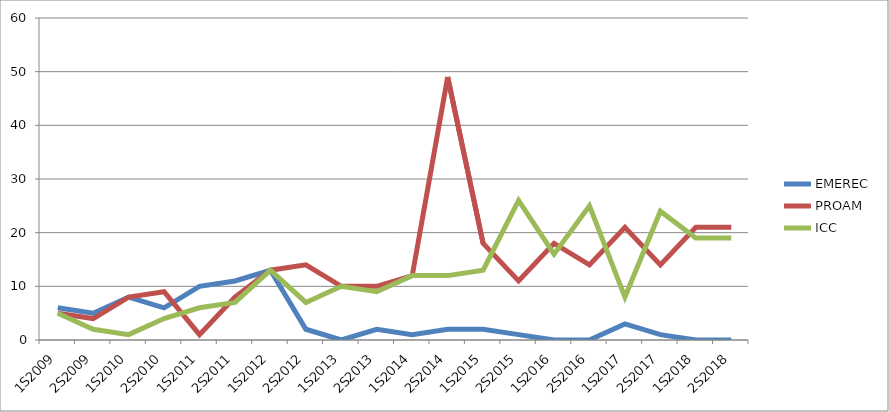
| Category | EMEREC | PROAM | ICC |
|---|---|---|---|
| 1S2009 | 6 | 5 | 5 |
| 2S2009 | 5 | 4 | 2 |
| 1S2010 | 8 | 8 | 1 |
| 2S2010 | 6 | 9 | 4 |
| 1S2011 | 10 | 1 | 6 |
| 2S2011 | 11 | 8 | 7 |
| 1S2012 | 13 | 13 | 13 |
| 2S2012 | 2 | 14 | 7 |
| 1S2013 | 0 | 10 | 10 |
| 2S2013 | 2 | 10 | 9 |
| 1S2014 | 1 | 12 | 12 |
| 2S2014 | 2 | 49 | 12 |
| 1S2015 | 2 | 18 | 13 |
| 2S2015 | 1 | 11 | 26 |
| 1S2016 | 0 | 18 | 16 |
| 2S2016 | 0 | 14 | 25 |
| 1S2017 | 3 | 21 | 8 |
| 2S2017 | 1 | 14 | 24 |
| 1S2018 | 0 | 21 | 19 |
| 2S2018 | 0 | 21 | 19 |